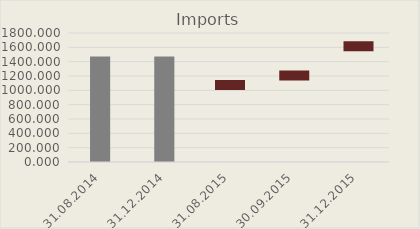
| Category | Imports |
|---|---|
| 31.08.2014 | 1473.237 |
| 31.12.2014 | 1473.237 |
| 31.08.2015 | 0 |
| 30.09.2015 | 0 |
| 31.12.2015 | 0 |